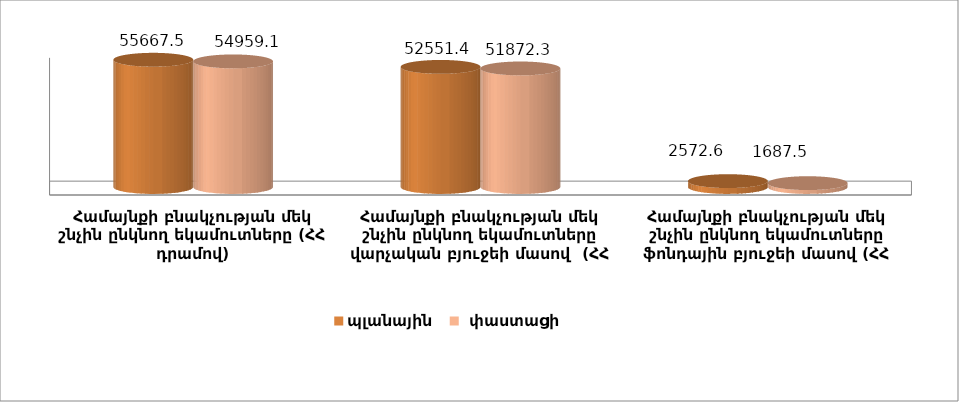
| Category | պլանային |  փաստացի |
|---|---|---|
| Համայնքի բնակչության մեկ շնչին ընկնող եկամուտները (ՀՀ դրամով) | 55667.546 | 54959.112 |
| Համայնքի բնակչության մեկ շնչին ընկնող եկամուտները վարչական բյուջեի մասով  (ՀՀ դրամով) | 52551.433 | 51872.258 |
| Համայնքի բնակչության մեկ շնչին ընկնող եկամուտները ֆոնդային բյուջեի մասով (ՀՀ դրամով) | 2572.598 | 1687.463 |